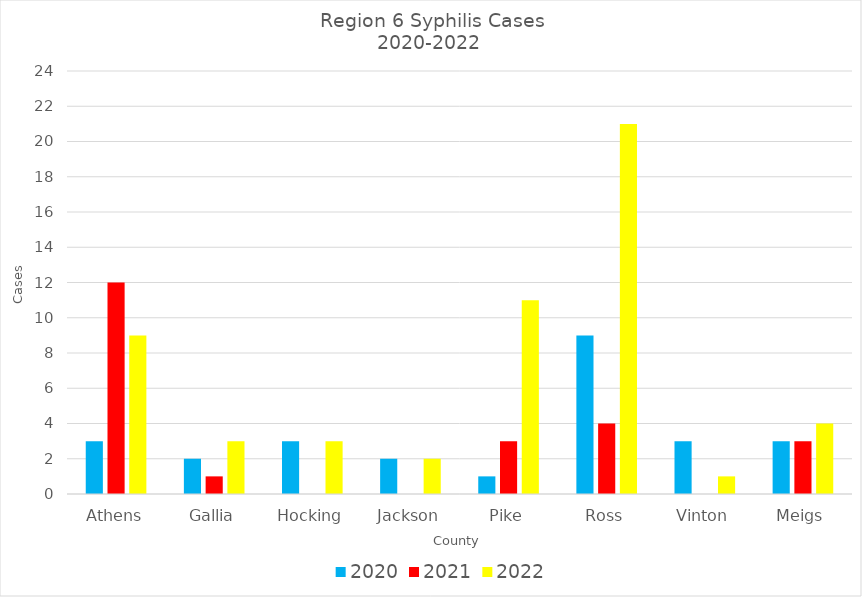
| Category | 2020 | 2021 | 2022 |
|---|---|---|---|
| Athens | 3 | 12 | 9 |
| Gallia | 2 | 1 | 3 |
| Hocking | 3 | 0 | 3 |
| Jackson | 2 | 0 | 2 |
| Pike | 1 | 3 | 11 |
| Ross | 9 | 4 | 21 |
| Vinton | 3 | 0 | 1 |
| Meigs | 3 | 3 | 4 |